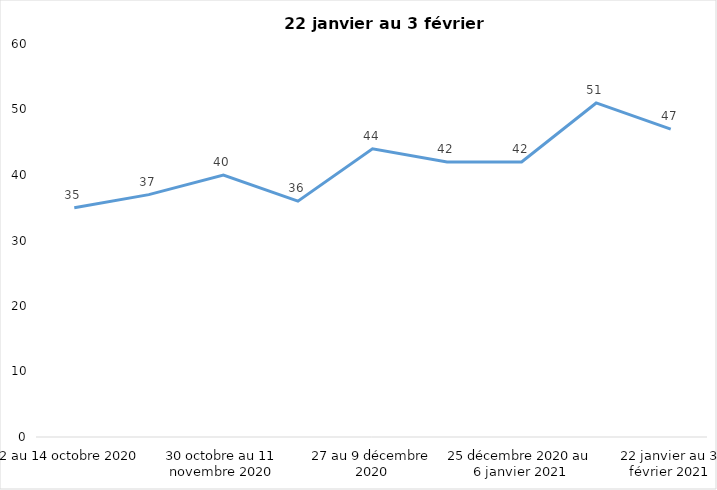
| Category | Toujours aux trois mesures |
|---|---|
| 2 au 14 octobre 2020 | 35 |
| 16 au 28 octobre 2020 | 37 |
| 30 octobre au 11 novembre 2020 | 40 |
| 13 au 25 novembre 2020 | 36 |
| 27 au 9 décembre 2020 | 44 |
| 11 au 25 décembre 2020 | 42 |
| 25 décembre 2020 au 6 janvier 2021 | 42 |
| 8 au 20 janvier 2021 | 51 |
| 22 janvier au 3 février 2021 | 47 |